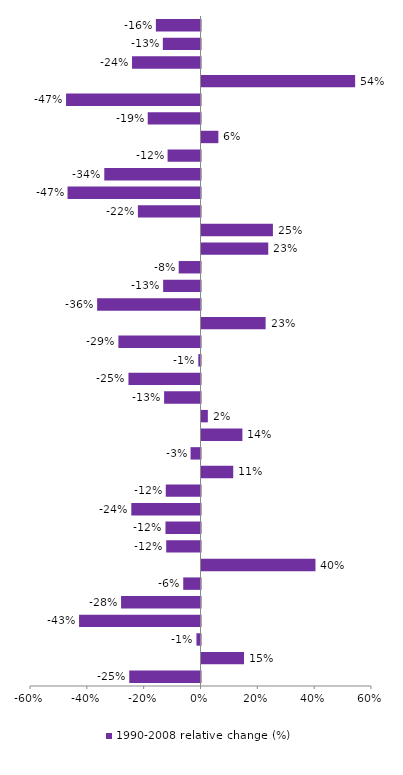
| Category | 1990-2008 relative change (%) |
|---|---|
| EU-27 | -0.157 |
| EU-15 | -0.133 |
| EU-12 | -0.241 |
| Turkey | 0.541 |
| Latvia | -0.473 |
| Sweden | -0.186 |
| Croatia | 0.059 |
| Switzerland | -0.116 |
| Romania | -0.339 |
| Lithuania | -0.468 |
| Hungary | -0.22 |
| Malta | 0.251 |
| Portugal | 0.235 |
| Liechtenstein | -0.077 |
| France | -0.131 |
| Slovakia | -0.364 |
| Spain | 0.226 |
| Bulgaria | -0.289 |
| Italy | -0.008 |
| United Kingdom | -0.254 |
| Poland | -0.128 |
| Austria | 0.022 |
| Slovenia | 0.144 |
| Norway | -0.035 |
| Greece | 0.112 |
| Denmark | -0.122 |
| Germany | -0.243 |
| Netherlands | -0.123 |
| Belgium | -0.121 |
| Cyprus | 0.401 |
| Finland | -0.061 |
| Czech Republic | -0.28 |
| Estonia | -0.427 |
| Ireland | -0.014 |
| Iceland | 0.15 |
| Luxembourg | -0.251 |